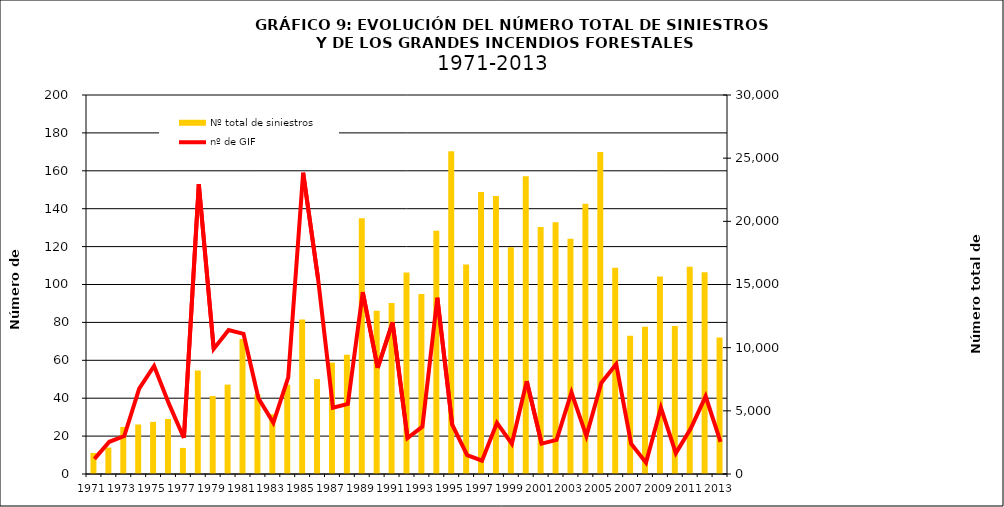
| Category | Nº total de siniestros |
|---|---|
| 1971.0 | 1665 |
| 1972.0 | 2093 |
| 1973.0 | 3724 |
| 1974.0 | 3920 |
| 1975.0 | 4128 |
| 1976.0 | 4356 |
| 1977.0 | 2064 |
| 1978.0 | 8193 |
| 1979.0 | 6171 |
| 1980.0 | 7075 |
| 1981.0 | 10688 |
| 1982.0 | 6308 |
| 1983.0 | 4736 |
| 1984.0 | 7073 |
| 1985.0 | 12235 |
| 1986.0 | 7514 |
| 1987.0 | 8816 |
| 1988.0 | 9440 |
| 1989.0 | 20250 |
| 1990.0 | 12914 |
| 1991.0 | 13529 |
| 1992.0 | 15956 |
| 1993.0 | 14253 |
| 1994.0 | 19249 |
| 1995.0 | 25557 |
| 1996.0 | 16586 |
| 1997.0 | 22320 |
| 1998.0 | 22003 |
| 1999.0 | 17943 |
| 2000.0 | 23574 |
| 2001.0 | 19547 |
| 2002.0 | 19929 |
| 2003.0 | 18616 |
| 2004.0 | 21396 |
| 2005.0 | 25492 |
| 2006.0 | 16334 |
| 2007.0 | 10936 |
| 2008.0 | 11655 |
| 2009.0 | 15643 |
| 2010.0 | 11722 |
| 2011.0 | 16414 |
| 2013.0 | 15978 |
| 2013.0 | 10797 |